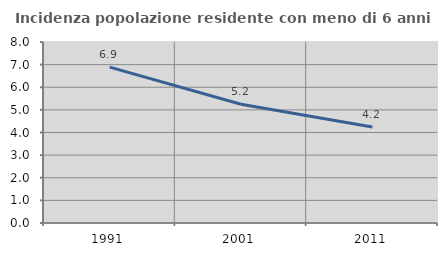
| Category | Incidenza popolazione residente con meno di 6 anni |
|---|---|
| 1991.0 | 6.889 |
| 2001.0 | 5.248 |
| 2011.0 | 4.24 |